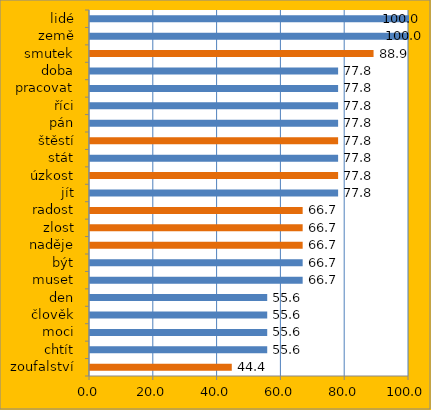
| Category | Series 0 |
|---|---|
| zoufalství | 44.444 |
| chtít | 55.556 |
| moci | 55.556 |
| člověk | 55.556 |
| den | 55.556 |
| muset | 66.667 |
| být | 66.667 |
| naděje | 66.667 |
| zlost | 66.667 |
| radost | 66.667 |
| jít | 77.778 |
| úzkost | 77.778 |
| stát | 77.778 |
| štěstí | 77.778 |
| pán | 77.778 |
| říci | 77.778 |
| pracovat | 77.778 |
| doba | 77.778 |
| smutek | 88.889 |
| země | 100 |
| lidé | 100 |